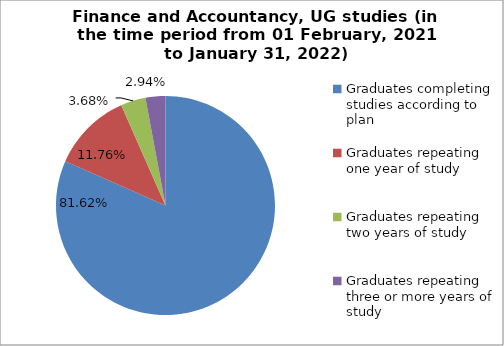
| Category | Series 0 |
|---|---|
| Graduates completing studies according to plan | 81.618 |
| Graduates repeating one year of study | 11.765 |
| Graduates repeating two years of study | 3.676 |
| Graduates repeating three or more years of study | 2.941 |